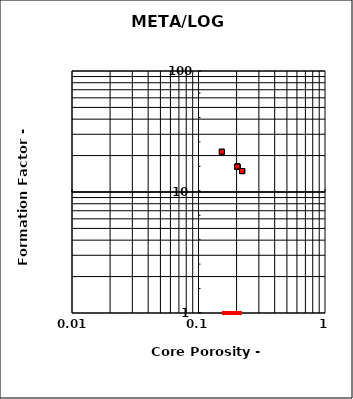
| Category | Series 0 |
|---|---|
| 0.153 | 21.5 |
| 0.153 | 21.5 |
| 0.153 | 21.5 |
| 0.203 | 16.2 |
| 0.203 | 16.2 |
| 0.203 | 16.2 |
| 0.203 | 16.2 |
| 0.203 | 16.2 |
| 0.203 | 16.2 |
| 0.203 | 16.2 |
| 0.221 | 14.9 |
| 0.221 | 14.9 |
| 0.221 | 14.9 |
| 0.221 | 14.9 |
| 0.221 | 14.9 |
| 0.221 | 14.9 |
| 0.221 | 14.9 |
| 0.221 | 14.9 |